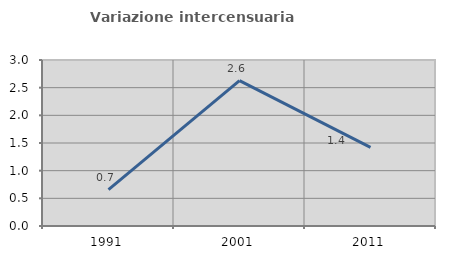
| Category | Variazione intercensuaria annua |
|---|---|
| 1991.0 | 0.656 |
| 2001.0 | 2.628 |
| 2011.0 | 1.421 |